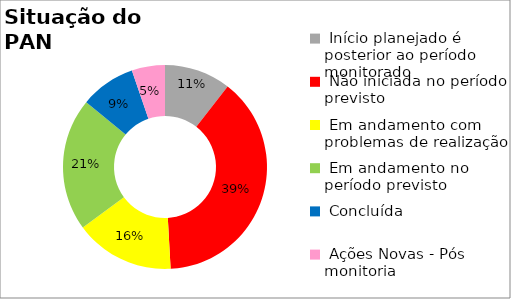
| Category | Series 0 |
|---|---|
|  Início planejado é posterior ao período monitorado | 0.105 |
|  Não iniciada no período previsto | 0.386 |
|  Em andamento com problemas de realização | 0.158 |
|  Em andamento no período previsto  | 0.211 |
|  Concluída | 0.088 |
|  Ações Novas - Pós monitoria | 0.053 |